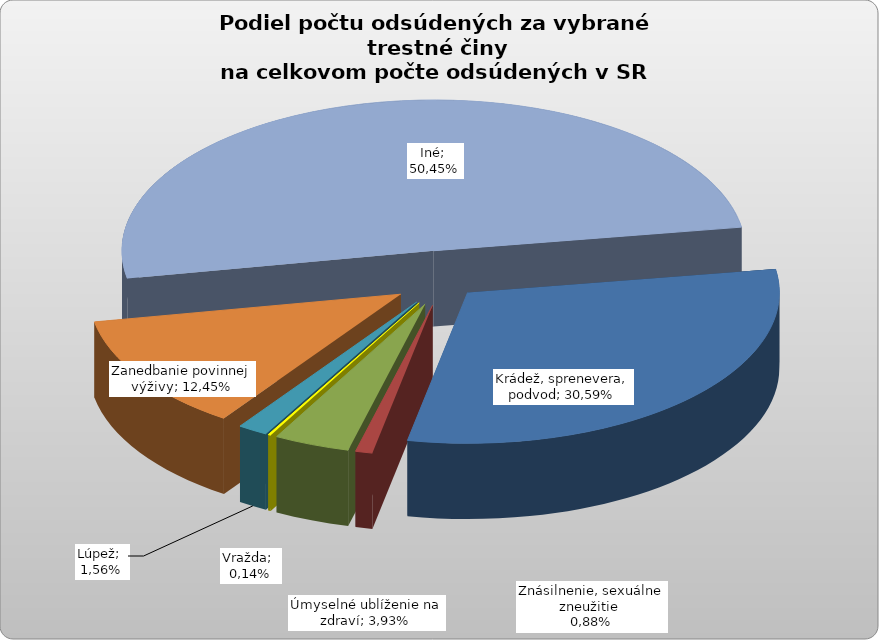
| Category | Series 0 |
|---|---|
| Krádež, sprenevera, podvod | 0.306 |
| Znásilnenie, sexuálne zneužitie | 0.009 |
| Úmyselné ublíženie na zdraví | 0.039 |
| Vražda | 0.001 |
| Lúpež | 0.016 |
| Zanedbanie povinnej výživy | 0.124 |
| Iné | 0.504 |